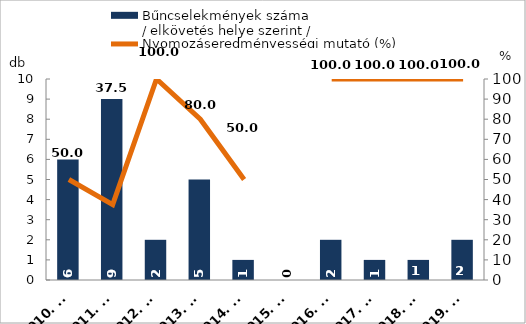
| Category | Bűncselekmények száma
/ elkövetés helye szerint / |
|---|---|
| 2010. év | 6 |
| 2011. év | 9 |
| 2012. év | 2 |
| 2013. év | 5 |
| 2014. év | 1 |
| 2015. év | 0 |
| 2016. év | 2 |
| 2017. év | 1 |
| 2018. év | 1 |
| 2019. év | 2 |